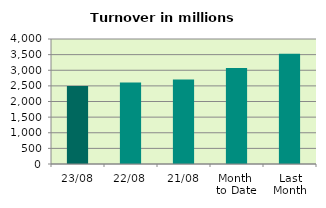
| Category | Series 0 |
|---|---|
| 23/08 | 2498.408 |
| 22/08 | 2605.309 |
| 21/08 | 2701.396 |
| Month 
to Date | 3071.695 |
| Last
Month | 3531.02 |